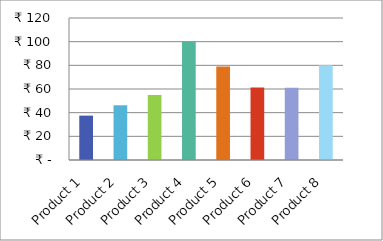
| Category | Profit/Unit |
|---|---|
| Product 1 | 37.5 |
| Product 2 | 46.25 |
| Product 3 | 55 |
| Product 4 | 100 |
| Product 5 | 79 |
| Product 6 | 61.25 |
| Product 7 | 61 |
| Product 8 | 80 |